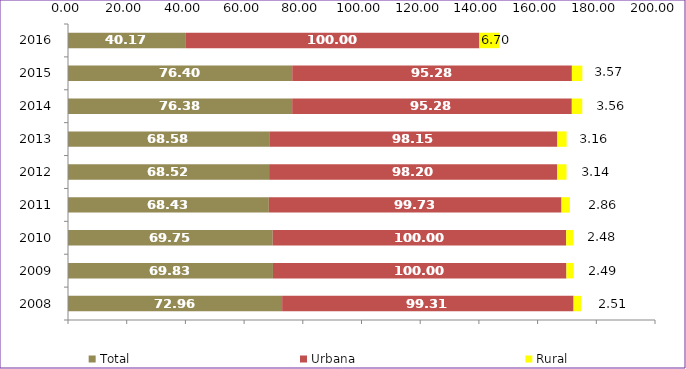
| Category | Total | Urbana | Rural |
|---|---|---|---|
| 2008.0 | 72.96 | 99.31 | 2.51 |
| 2009.0 | 69.83 | 100 | 2.49 |
| 2010.0 | 69.75 | 100 | 2.48 |
| 2011.0 | 68.43 | 99.73 | 2.86 |
| 2012.0 | 68.52 | 98.2 | 3.14 |
| 2013.0 | 68.58 | 98.15 | 3.16 |
| 2014.0 | 76.38 | 95.28 | 3.56 |
| 2015.0 | 76.4 | 95.28 | 3.57 |
| 2016.0 | 40.17 | 100 | 6.7 |